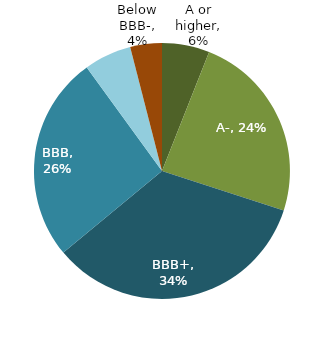
| Category | Series 0 |
|---|---|
| A or higher | 0.06 |
| A- | 0.24 |
| BBB+ | 0.34 |
| BBB | 0.26 |
| BBB- | 0.06 |
| Below BBB- | 0.04 |